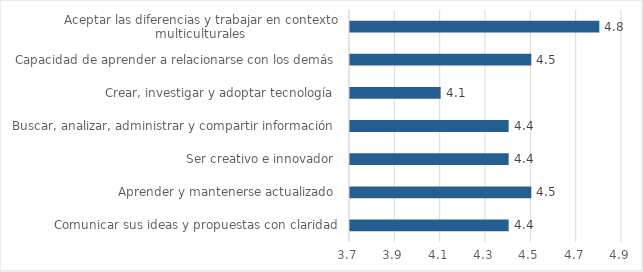
| Category | Series 5 | Promedio |
|---|---|---|
| Comunicar sus ideas y propuestas con claridad |  | 4.4 |
| Aprender y mantenerse actualizado  |  | 4.5 |
| Ser creativo e innovador  |  | 4.4 |
| Buscar, analizar, administrar y compartir información  |  | 4.4 |
| Crear, investigar y adoptar tecnología  |  | 4.1 |
| Capacidad de aprender a relacionarse con los demás  |  | 4.5 |
| Aceptar las diferencias y trabajar en contexto multiculturales  |  | 4.8 |